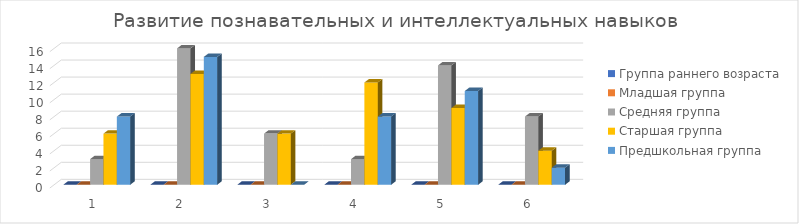
| Category | Группа раннего возраста | Младшая группа | Средняя группа | Старшая группа | Предшкольная группа |
|---|---|---|---|---|---|
| 0 | 0 | 0 | 3 | 6 | 8 |
| 1 | 0 | 0 | 16 | 13 | 15 |
| 2 | 0 | 0 | 6 | 6 | 0 |
| 3 | 0 | 0 | 3 | 12 | 8 |
| 4 | 0 | 0 | 14 | 9 | 11 |
| 5 | 0 | 0 | 8 | 4 | 2 |